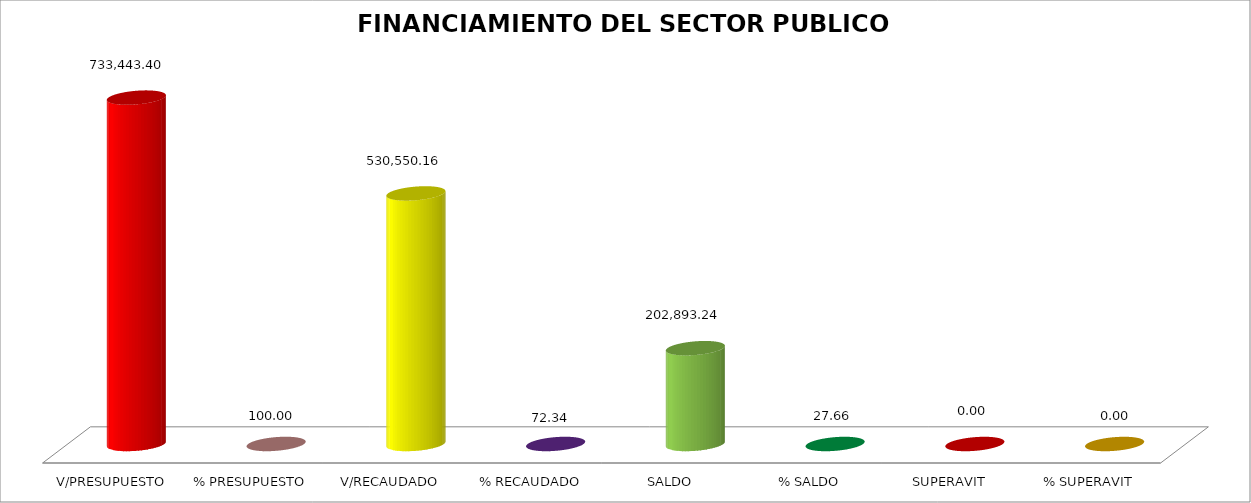
| Category | FINANCIAMIENTO DEL SECTOR PUBLICO INTERNO |
|---|---|
| V/PRESUPUESTO | 733443.4 |
| % PRESUPUESTO | 100 |
| V/RECAUDADO | 530550.16 |
| % RECAUDADO | 72.337 |
| SALDO | 202893.24 |
| % SALDO | 27.663 |
| SUPERAVIT | 0 |
| % SUPERAVIT | 0 |